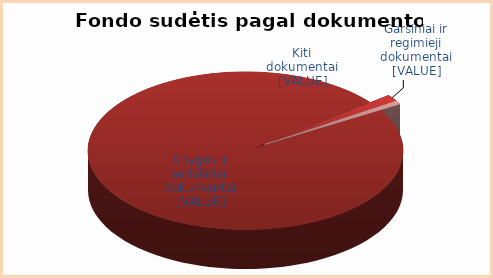
| Category | Series 0 |
|---|---|
| Knygos | 0.98 |
| Garsiniai | 0.013 |
| Kiti | 0.007 |